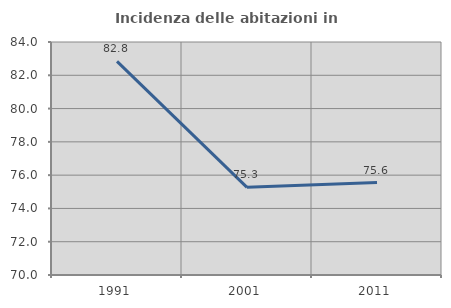
| Category | Incidenza delle abitazioni in proprietà  |
|---|---|
| 1991.0 | 82.84 |
| 2001.0 | 75.268 |
| 2011.0 | 75.554 |